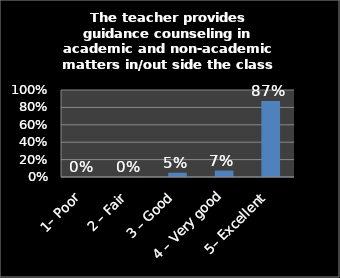
| Category | Series 0 |
|---|---|
| 1– Poor | 0 |
| 2 – Fair | 0.003 |
| 3 – Good | 0.049 |
| 4 – Very good | 0.074 |
| 5– Excellent | 0.873 |